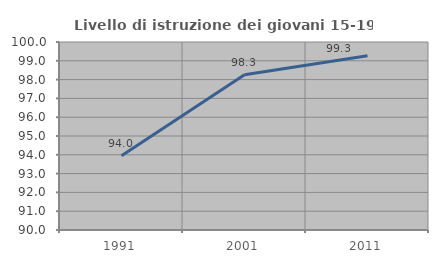
| Category | Livello di istruzione dei giovani 15-19 anni |
|---|---|
| 1991.0 | 93.953 |
| 2001.0 | 98.256 |
| 2011.0 | 99.265 |